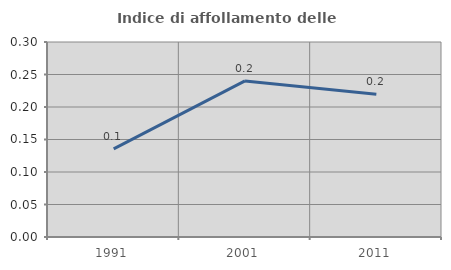
| Category | Indice di affollamento delle abitazioni  |
|---|---|
| 1991.0 | 0.136 |
| 2001.0 | 0.24 |
| 2011.0 | 0.22 |